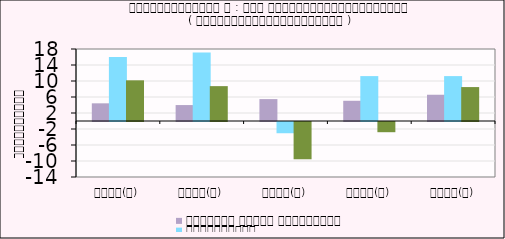
| Category | កសិកម្ម នេសាទ និងព្រៃឈើ | ឧស្សាហកម្ម | សេវាកម្ម |
|---|---|---|---|
| ២០១៨(ក) | 4.417 | 15.988 | 10.172 |
| ២០១៩(ក) | 3.986 | 17.146 | 8.716 |
| ២០២០(ប) | 5.475 | -2.808 | -9.315 |
| ២០២១(ប) | 5.052 | 11.226 | -2.551 |
| ២០២២(ប) | 6.564 | 11.226 | 8.482 |